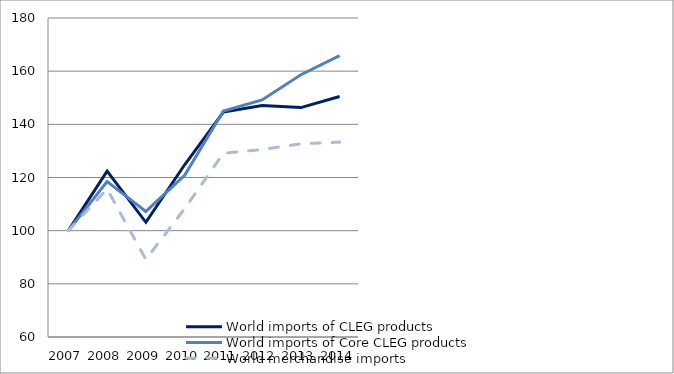
| Category | World imports of CLEG products | World imports of Core CLEG products | World merchandise imports |
|---|---|---|---|
| 2007.0 | 100 | 100 | 100 |
| 2008.0 | 122.397 | 118.476 | 115.645 |
| 2009.0 | 103.154 | 107.235 | 89.197 |
| 2010.0 | 124.792 | 120.799 | 108.241 |
| 2011.0 | 144.634 | 144.985 | 129.121 |
| 2012.0 | 147.086 | 149.188 | 130.53 |
| 2013.0 | 146.303 | 158.666 | 132.666 |
| 2014.0 | 150.466 | 165.859 | 133.315 |